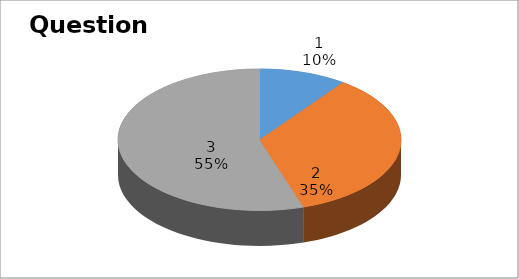
| Category | Series 0 |
|---|---|
| 0 | 2 |
| 1 | 7 |
| 2 | 11 |